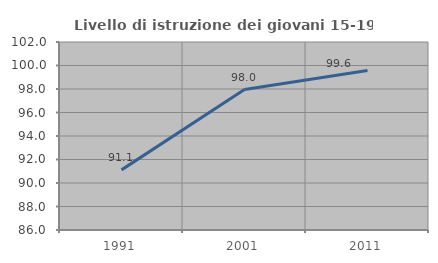
| Category | Livello di istruzione dei giovani 15-19 anni |
|---|---|
| 1991.0 | 91.117 |
| 2001.0 | 97.952 |
| 2011.0 | 99.569 |